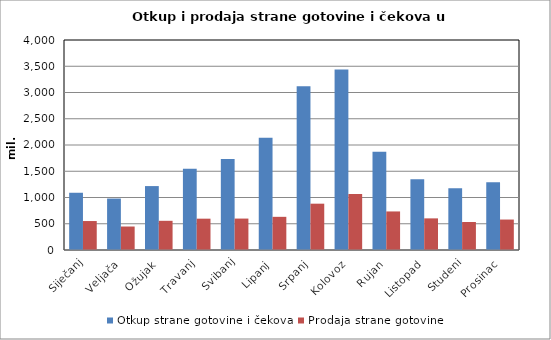
| Category | Otkup strane gotovine i čekova  | Prodaja strane gotovine  |
|---|---|---|
| Siječanj | 1090340045 | 551698079 |
| Veljača | 980011582 | 447286680 |
| Ožujak | 1217532027 | 556033862 |
| Travanj | 1546159839 | 596603188 |
| Svibanj | 1731143242 | 598657862 |
| Lipanj | 2137910745 | 631722946 |
| Srpanj | 3119366330 | 882262893 |
| Kolovoz | 3436460090 | 1066196079 |
| Rujan | 1869385965 | 734356399 |
| Listopad | 1349217768 | 602411624 |
| Studeni | 1176185369 | 533365532 |
| Prosinac | 1289642674 | 580067435 |